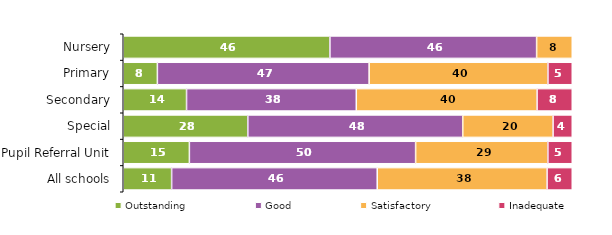
| Category | Outstanding | Good | Satisfactory | Inadequate |
|---|---|---|---|---|
| Nursery | 46.032 | 46.032 | 7.937 | 0 |
| Primary | 7.602 | 47.164 | 39.821 | 5.413 |
| Secondary | 14.094 | 37.808 | 40.268 | 7.83 |
| Special | 27.744 | 47.866 | 20.122 | 4.268 |
| Pupil Referral Unit | 14.729 | 50.388 | 29.457 | 5.426 |
| All schools | 10.775 | 45.791 | 37.827 | 5.606 |